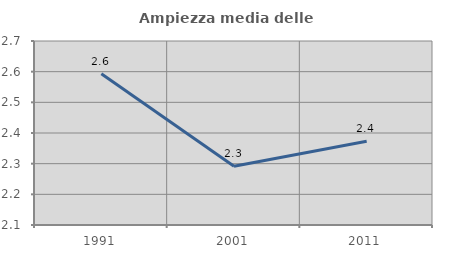
| Category | Ampiezza media delle famiglie |
|---|---|
| 1991.0 | 2.593 |
| 2001.0 | 2.292 |
| 2011.0 | 2.373 |